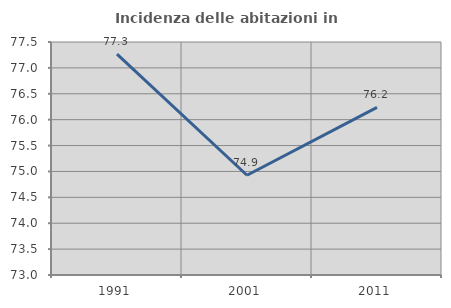
| Category | Incidenza delle abitazioni in proprietà  |
|---|---|
| 1991.0 | 77.266 |
| 2001.0 | 74.926 |
| 2011.0 | 76.236 |